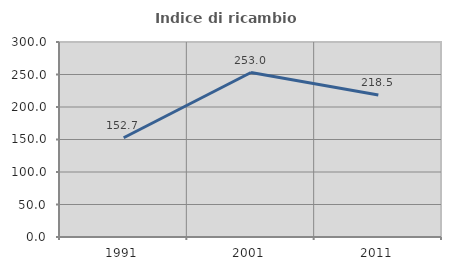
| Category | Indice di ricambio occupazionale  |
|---|---|
| 1991.0 | 152.72 |
| 2001.0 | 253.039 |
| 2011.0 | 218.487 |